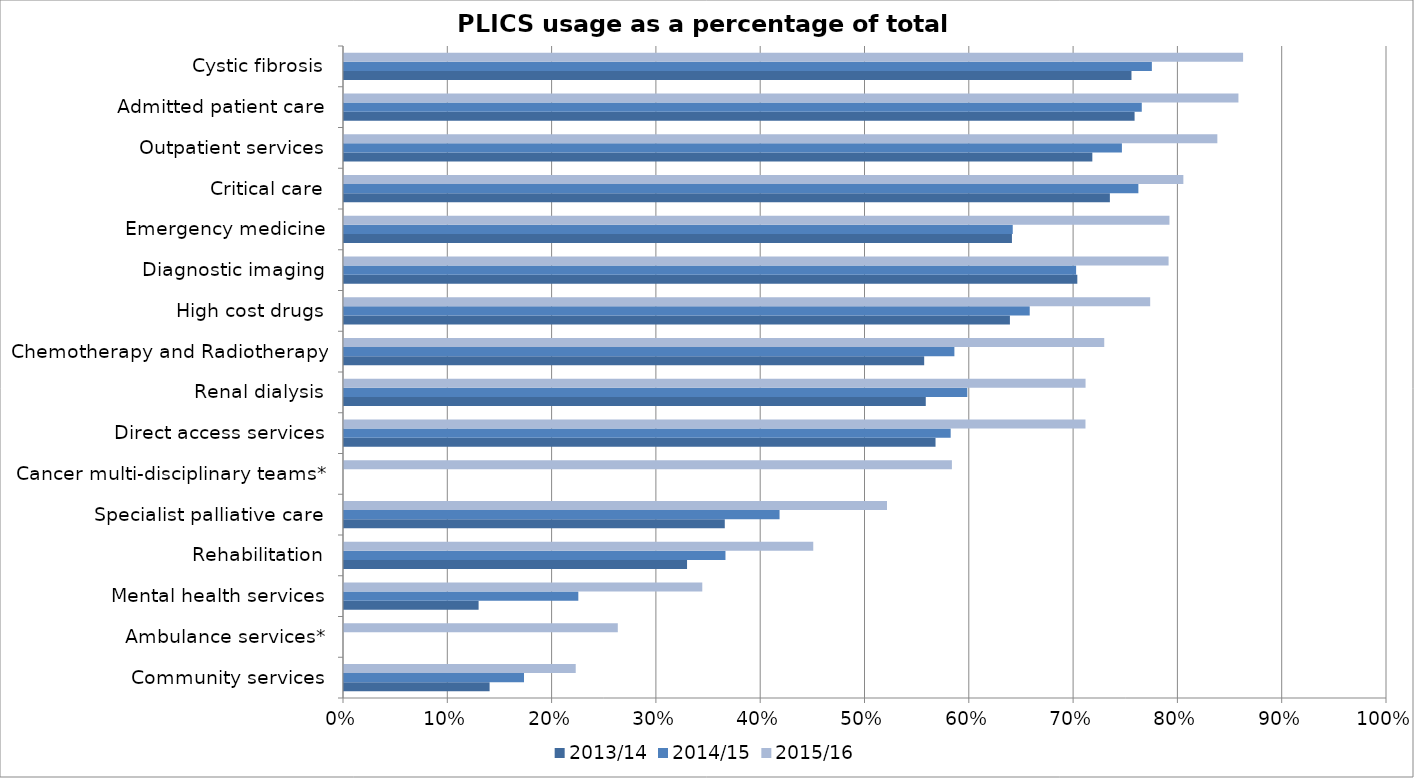
| Category | 2013/14 | 2014/15 | 2015/16 |
|---|---|---|---|
| Community services | 0.14 | 0.173 | 0.222 |
| Ambulance services* | 0 | 0 | 0.263 |
| Mental health services | 0.129 | 0.225 | 0.344 |
| Rehabilitation | 0.329 | 0.366 | 0.45 |
| Specialist palliative care | 0.365 | 0.418 | 0.521 |
| Cancer multi-disciplinary teams* | 0 | 0 | 0.583 |
| Direct access services | 0.567 | 0.582 | 0.711 |
| Renal dialysis | 0.558 | 0.598 | 0.711 |
| Chemotherapy and Radiotherapy | 0.556 | 0.585 | 0.729 |
| High cost drugs | 0.638 | 0.657 | 0.773 |
| Diagnostic imaging | 0.703 | 0.702 | 0.791 |
| Emergency medicine | 0.64 | 0.641 | 0.791 |
| Critical care | 0.734 | 0.762 | 0.805 |
| Outpatient services | 0.717 | 0.746 | 0.837 |
| Admitted patient care | 0.758 | 0.765 | 0.858 |
| Cystic fibrosis | 0.755 | 0.775 | 0.862 |